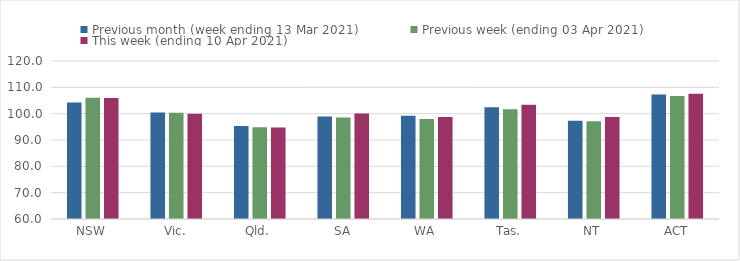
| Category | Previous month (week ending 13 Mar 2021) | Previous week (ending 03 Apr 2021) | This week (ending 10 Apr 2021) |
|---|---|---|---|
| NSW | 104.23 | 106 | 105.94 |
| Vic. | 100.44 | 100.39 | 99.94 |
| Qld. | 95.33 | 94.87 | 94.7 |
| SA | 98.95 | 98.55 | 100.07 |
| WA | 99.17 | 97.98 | 98.75 |
| Tas. | 102.46 | 101.68 | 103.42 |
| NT | 97.35 | 97.15 | 98.74 |
| ACT | 107.27 | 106.67 | 107.56 |